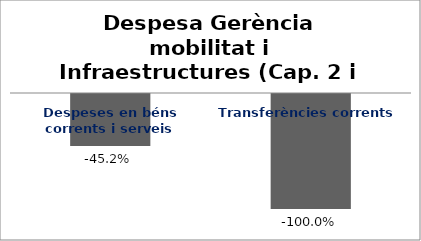
| Category | Series 0 |
|---|---|
| Despeses en béns corrents i serveis | -0.452 |
| Transferències corrents | -1 |